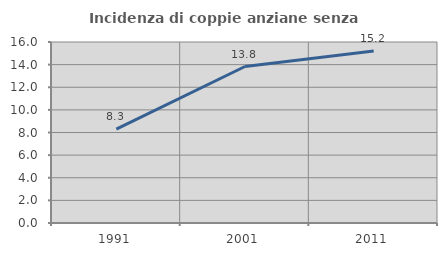
| Category | Incidenza di coppie anziane senza figli  |
|---|---|
| 1991.0 | 8.297 |
| 2001.0 | 13.834 |
| 2011.0 | 15.2 |